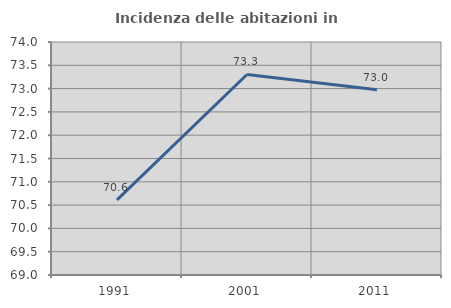
| Category | Incidenza delle abitazioni in proprietà  |
|---|---|
| 1991.0 | 70.613 |
| 2001.0 | 73.303 |
| 2011.0 | 72.976 |